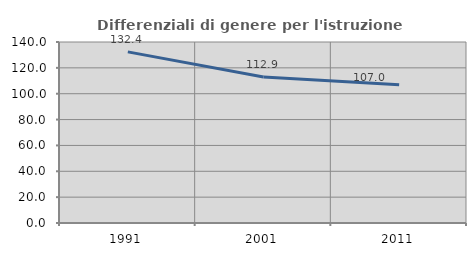
| Category | Differenziali di genere per l'istruzione superiore |
|---|---|
| 1991.0 | 132.374 |
| 2001.0 | 112.908 |
| 2011.0 | 106.963 |